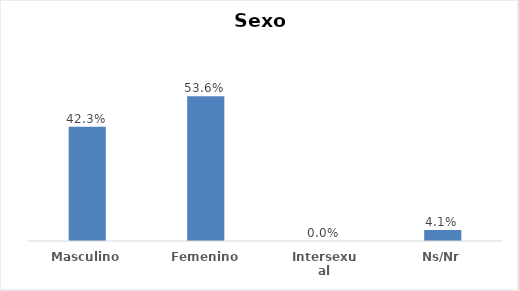
| Category | Series 0 |
|---|---|
| Masculino | 0.423 |
| Femenino | 0.536 |
| Intersexual | 0 |
| Ns/Nr | 0.041 |